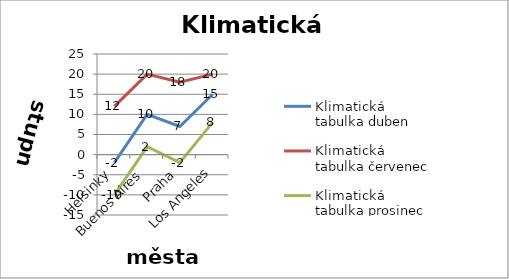
| Category | Klimatická tabulka duben | Klimatická tabulka červenec | Klimatická tabulka prosinec |
|---|---|---|---|
| Helsinky | -2 | 12 | -10 |
| Buenos Aires | 10 | 20 | 2 |
| Praha | 7 | 18 | -2 |
| Los Angeles | 15 | 20 | 8 |